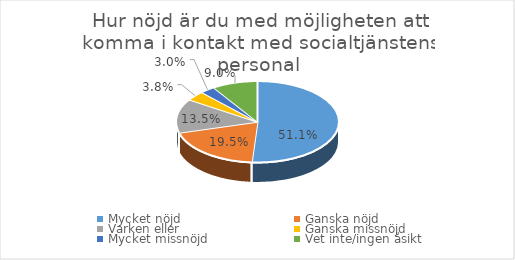
| Category | Series 0 |
|---|---|
| Mycket nöjd  | 0.511 |
| Ganska nöjd | 0.195 |
| Varken eller  | 0.135 |
| Ganska missnöjd | 0.038 |
| Mycket missnöjd  | 0.03 |
| Vet inte/ingen åsikt | 0.09 |